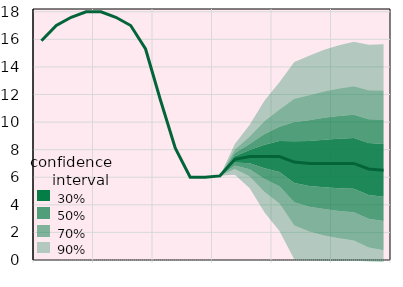
| Category | Облікова ставка, % |
|---|---|
|  | 15.9 |
|  | 17 |
|  | 17.6 |
| IV.18 | 18 |
|  | 18 |
|  | 17.6 |
|  | 17 |
| IV.19 | 15.3 |
|  | 11.6 |
|  | 8.1 |
|  | 6 |
| IV.20 | 6 |
|  | 6.1 |
|  | 7.3 |
|  | 7.5 |
| IV.21 | 7.5 |
|  | 7.5 |
|  | 7.1 |
|  | 7 |
| IV.22 | 7 |
|  | 7 |
|  | 7 |
|  | 6.6 |
| IV.23 | 6.5 |